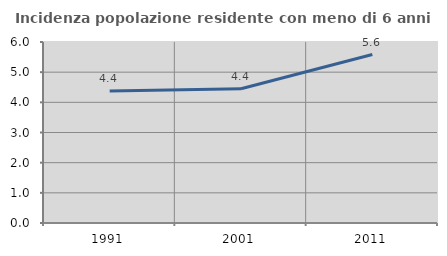
| Category | Incidenza popolazione residente con meno di 6 anni |
|---|---|
| 1991.0 | 4.374 |
| 2001.0 | 4.449 |
| 2011.0 | 5.585 |